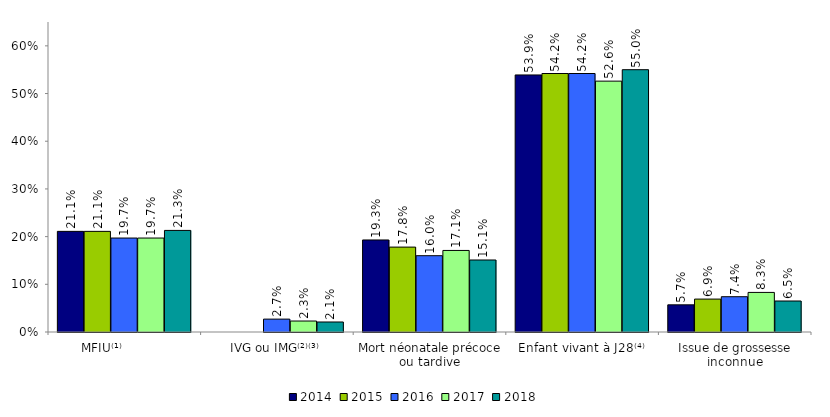
| Category | 2014 | 2015 | 2016 | 2017 | 2018 |
|---|---|---|---|---|---|
| MFIU⁽¹⁾            | 0.211 | 0.211 | 0.197 | 0.197 | 0.213 |
| IVG ou IMG⁽²⁾⁽³⁾ | 0 | 0 | 0.027 | 0.023 | 0.021 |
| Mort néonatale précoce ou tardive | 0.193 | 0.178 | 0.16 | 0.171 | 0.151 |
| Enfant vivant à J28⁽⁴⁾ | 0.539 | 0.542 | 0.542 | 0.526 | 0.55 |
| Issue de grossesse inconnue | 0.057 | 0.069 | 0.074 | 0.083 | 0.065 |